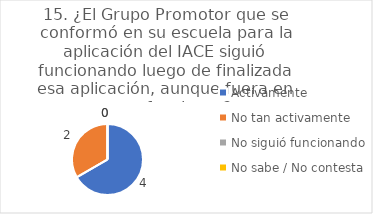
| Category | 15. ¿El Grupo Promotor que se conformó en su escuela para la aplicación del IACE siguió funcionando luego de finalizada esa aplicación, aunque fuera en otras funciones? |
|---|---|
| Activamente  | 0.667 |
| No tan activamente  | 0.333 |
| No siguió funcionando  | 0 |
| No sabe / No contesta | 0 |